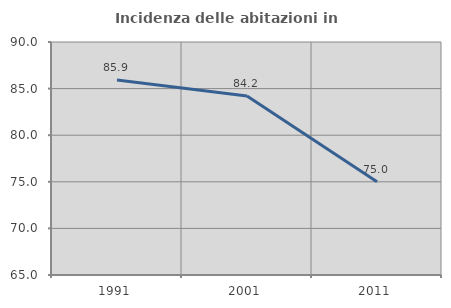
| Category | Incidenza delle abitazioni in proprietà  |
|---|---|
| 1991.0 | 85.926 |
| 2001.0 | 84.211 |
| 2011.0 | 75 |